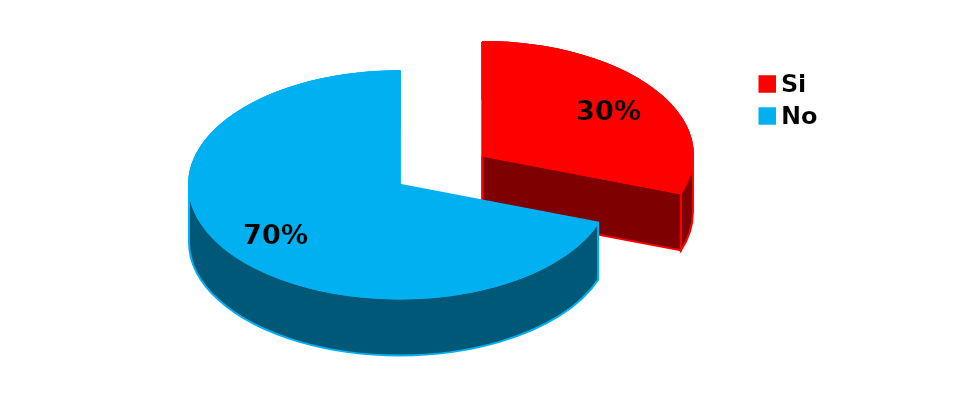
| Category | Series 0 |
|---|---|
| Si | 31 |
| No | 71 |